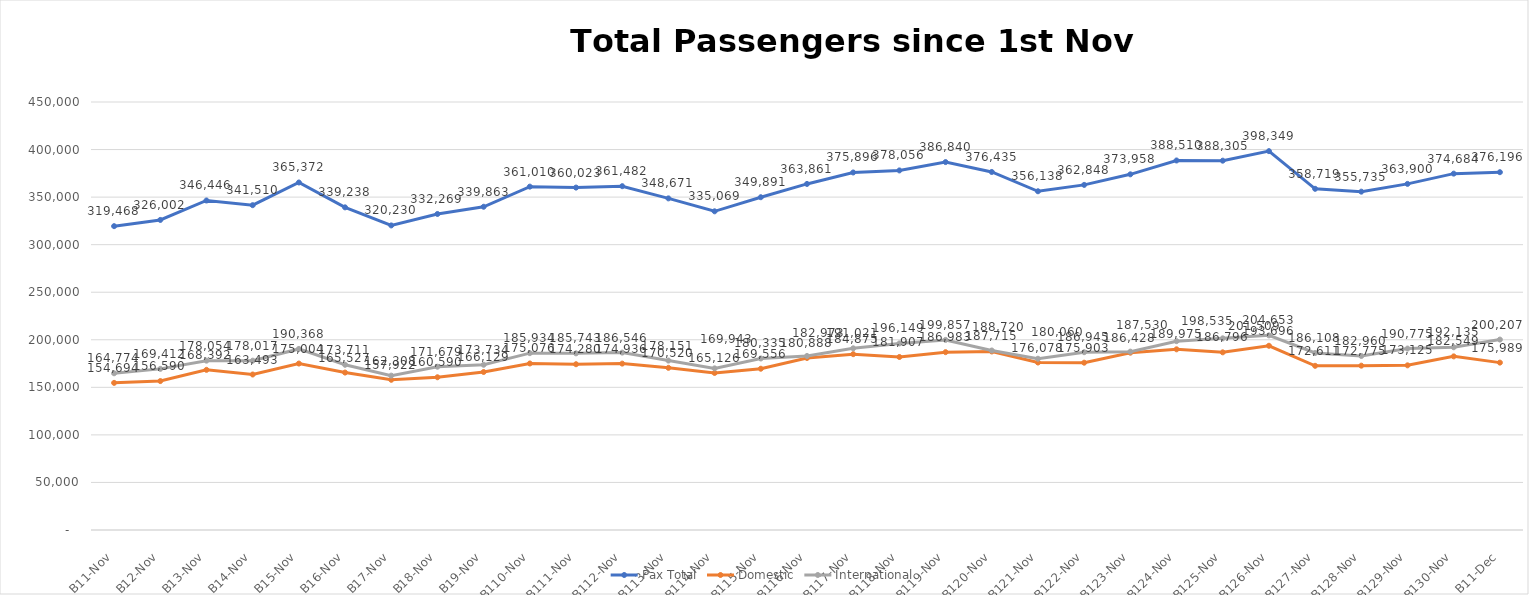
| Category | Pax Total | Domestic | International |
|---|---|---|---|
| 2023-11-01 | 319468 | 154694 | 164774 |
| 2023-11-02 | 326002 | 156590 | 169412 |
| 2023-11-03 | 346446 | 168392 | 178054 |
| 2023-11-04 | 341510 | 163493 | 178017 |
| 2023-11-05 | 365372 | 175004 | 190368 |
| 2023-11-06 | 339238 | 165527 | 173711 |
| 2023-11-07 | 320230 | 157922 | 162308 |
| 2023-11-08 | 332269 | 160590 | 171679 |
| 2023-11-09 | 339863 | 166129 | 173734 |
| 2023-11-10 | 361010 | 175076 | 185934 |
| 2023-11-11 | 360023 | 174280 | 185743 |
| 2023-11-12 | 361482 | 174936 | 186546 |
| 2023-11-13 | 348671 | 170520 | 178151 |
| 2023-11-14 | 335069 | 165126 | 169943 |
| 2023-11-15 | 349891 | 169556 | 180335 |
| 2023-11-16 | 363861 | 180888 | 182973 |
| 2023-11-17 | 375896 | 184875 | 191021 |
| 2023-11-18 | 378056 | 181907 | 196149 |
| 2023-11-19 | 386840 | 186983 | 199857 |
| 2023-11-20 | 376435 | 187715 | 188720 |
| 2023-11-21 | 356138 | 176078 | 180060 |
| 2023-11-22 | 362848 | 175903 | 186945 |
| 2023-11-23 | 373958 | 186428 | 187530 |
| 2023-11-24 | 388510 | 189975 | 198535 |
| 2023-11-25 | 388305 | 186796 | 201509 |
| 2023-11-26 | 398349 | 193696 | 204653 |
| 2023-11-27 | 358719 | 172611 | 186108 |
| 2023-11-28 | 355735 | 172775 | 182960 |
| 2023-11-29 | 363900 | 173125 | 190775 |
| 2023-11-30 | 374684 | 182549 | 192135 |
| 2023-12-01 | 376196 | 175989 | 200207 |